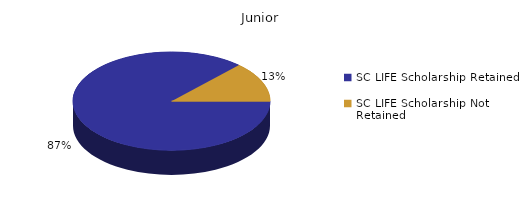
| Category | Junior |
|---|---|
| SC LIFE Scholarship Retained  | 1598 |
| SC LIFE Scholarship Not Retained  | 240 |